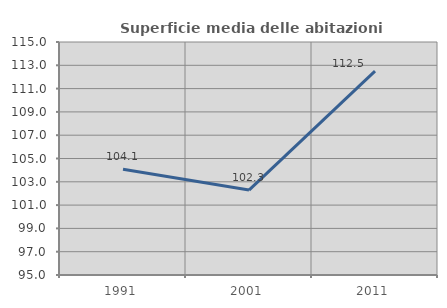
| Category | Superficie media delle abitazioni occupate |
|---|---|
| 1991.0 | 104.084 |
| 2001.0 | 102.292 |
| 2011.0 | 112.507 |